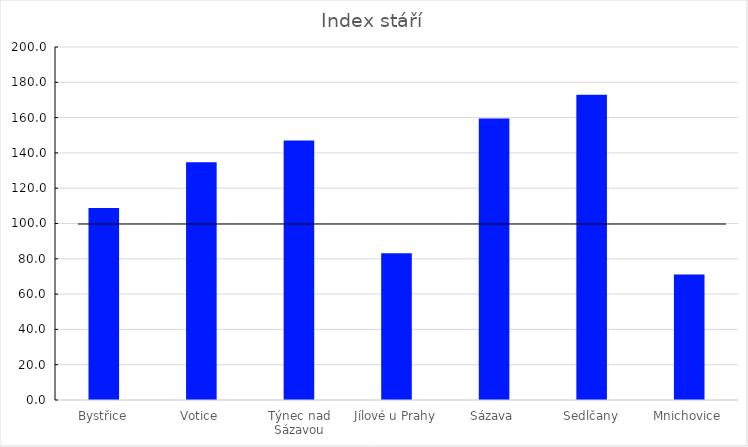
| Category | Series 0 |
|---|---|
| Bystřice | 108.713 |
| Votice | 134.73 |
| Týnec nad Sázavou | 147.009 |
| Jílové u Prahy | 83.2 |
| Sázava | 159.5 |
| Sedlčany | 172.9 |
| Mnichovice | 71.114 |